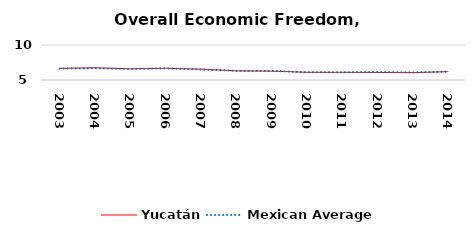
| Category | Yucatán | Mexican Average  |
|---|---|---|
| 2003.0 | 6.665 | 6.632 |
| 2004.0 | 6.745 | 6.678 |
| 2005.0 | 6.6 | 6.582 |
| 2006.0 | 6.674 | 6.668 |
| 2007.0 | 6.548 | 6.508 |
| 2008.0 | 6.306 | 6.3 |
| 2009.0 | 6.267 | 6.3 |
| 2010.0 | 6.099 | 6.105 |
| 2011.0 | 6.097 | 6.103 |
| 2012.0 | 6.08 | 6.144 |
| 2013.0 | 6.047 | 6.087 |
| 2014.0 | 6.196 | 6.195 |